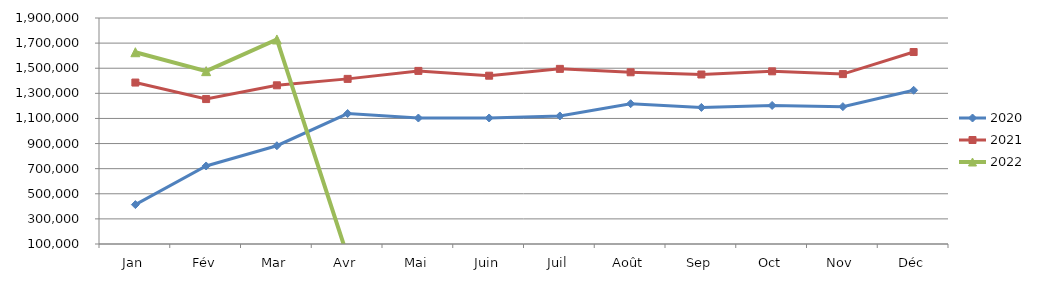
| Category | 2020 | 2021 | 2022 |
|---|---|---|---|
| Jan | 413718.973 | 1385841.188 | 1627456.472 |
| Fév | 721421.241 | 1254294.981 | 1476666.108 |
| Mar | 882604.122 | 1363936.74 | 1729038.394 |
| Avr | 1139215.204 | 1415132.587 | 0 |
| Mai | 1103343.599 | 1478708.989 | 0 |
| Juin | 1103576.761 | 1440368.873 | 0 |
| Juil | 1119722.736 | 1494841.171 | 0 |
| Août | 1217354.798 | 1467575.235 | 0 |
| Sep | 1187669.872 | 1450120.701 | 0 |
| Oct | 1203449.934 | 1475187.371 | 0 |
| Nov | 1194014.644 | 1453215.071 | 0 |
| Déc | 1324311.651 | 1629008.122 | 0 |